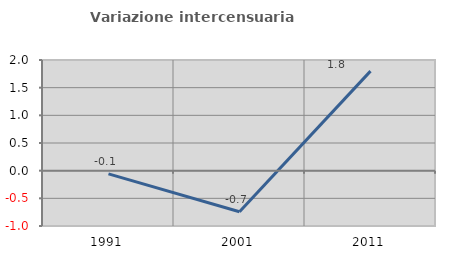
| Category | Variazione intercensuaria annua |
|---|---|
| 1991.0 | -0.059 |
| 2001.0 | -0.742 |
| 2011.0 | 1.799 |